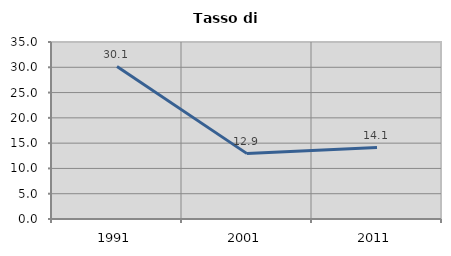
| Category | Tasso di disoccupazione   |
|---|---|
| 1991.0 | 30.146 |
| 2001.0 | 12.928 |
| 2011.0 | 14.134 |